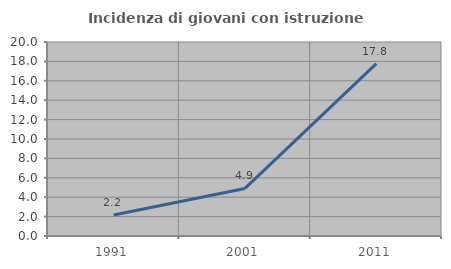
| Category | Incidenza di giovani con istruzione universitaria |
|---|---|
| 1991.0 | 2.162 |
| 2001.0 | 4.902 |
| 2011.0 | 17.778 |